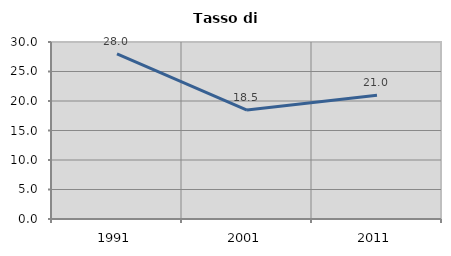
| Category | Tasso di disoccupazione   |
|---|---|
| 1991.0 | 28.003 |
| 2001.0 | 18.456 |
| 2011.0 | 20.994 |